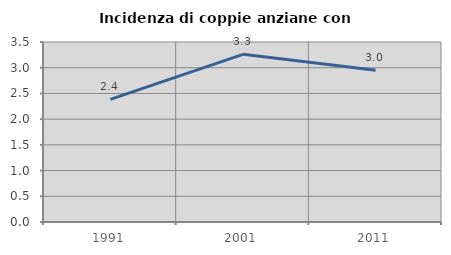
| Category | Incidenza di coppie anziane con figli |
|---|---|
| 1991.0 | 2.384 |
| 2001.0 | 3.26 |
| 2011.0 | 2.953 |